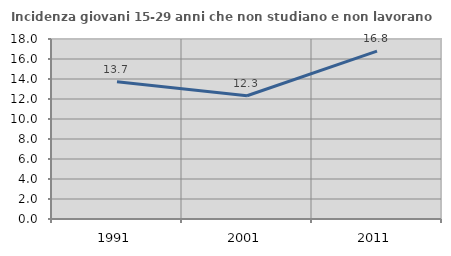
| Category | Incidenza giovani 15-29 anni che non studiano e non lavorano  |
|---|---|
| 1991.0 | 13.715 |
| 2001.0 | 12.329 |
| 2011.0 | 16.788 |